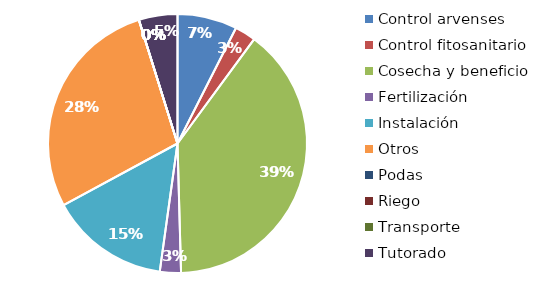
| Category | Valor |
|---|---|
| Control arvenses | 425000 |
| Control fitosanitario | 150000 |
| Cosecha y beneficio | 2250000 |
| Fertilización | 150000 |
| Instalación | 850000 |
| Otros | 1600000 |
| Podas | 0 |
| Riego | 0 |
| Transporte | 0 |
| Tutorado | 275000 |